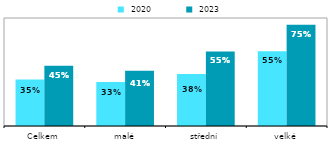
| Category |  2020 |  2023 |
|---|---|---|
| Celkem | 0.345 | 0.447 |
| malé | 0.326 | 0.41 |
| střední | 0.385 | 0.552 |
| velké | 0.554 | 0.75 |